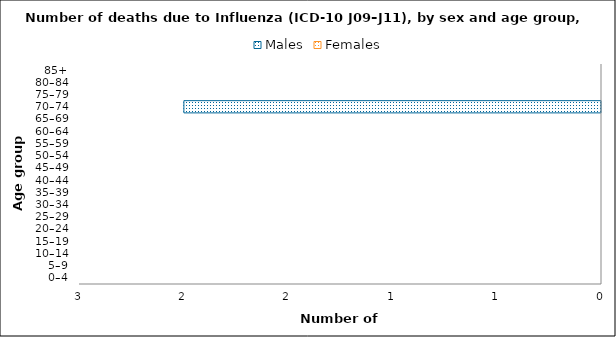
| Category | Males | Females |
|---|---|---|
| 0–4 | 0 | 0 |
| 5–9 | 0 | 0 |
| 10–14 | 0 | 0 |
| 15–19 | 0 | 0 |
| 20–24 | 0 | 0 |
| 25–29 | 0 | 0 |
| 30–34 | 0 | 0 |
| 35–39 | 0 | 0 |
| 40–44 | 0 | 0 |
| 45–49 | 0 | 0 |
| 50–54 | 0 | 0 |
| 55–59 | 0 | 0 |
| 60–64 | 0 | 0 |
| 65–69 | 0 | 0 |
| 70–74 | -2 | 0 |
| 75–79 | 0 | 0 |
| 80–84 | 0 | 0 |
| 85+ | 0 | 0 |